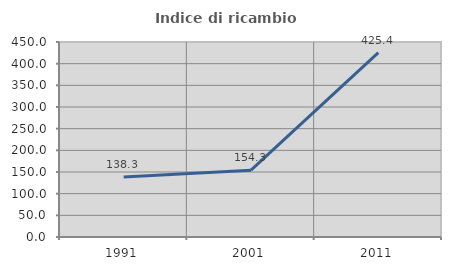
| Category | Indice di ricambio occupazionale  |
|---|---|
| 1991.0 | 138.333 |
| 2001.0 | 154.31 |
| 2011.0 | 425.373 |